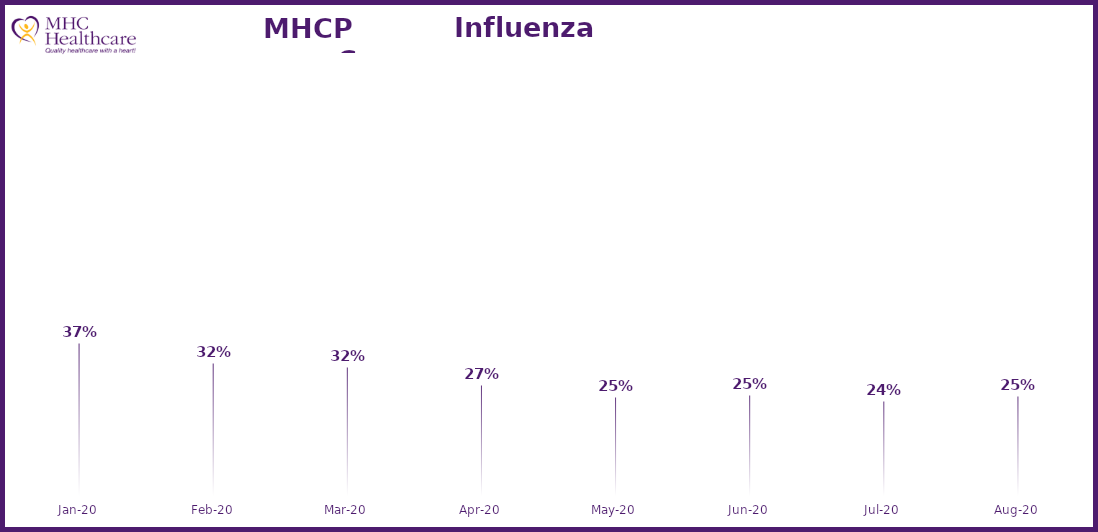
| Category | Online Access to Health Information |
|---|---|
| 2020-01-01 | 0.368 |
| 2020-02-01 | 0.325 |
| 2020-03-01 | 0.316 |
| 2020-04-01 | 0.275 |
| 2020-05-01 | 0.248 |
| 2020-06-01 | 0.252 |
| 2020-07-01 | 0.239 |
| 2020-08-01 | 0.25 |